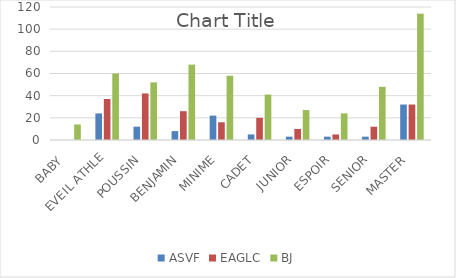
| Category | ASVF | EAGLC | BJ |
|---|---|---|---|
| BABY  | 0 | 0 | 14 |
| EVEIL ATHLE | 24 | 37 | 60 |
| POUSSIN  | 12 | 42 | 52 |
| BENJAMIN  | 8 | 26 | 68 |
| MINIME  | 22 | 16 | 58 |
| CADET  | 5 | 20 | 41 |
| JUNIOR  | 3 | 10 | 27 |
| ESPOIR  | 3 | 5 | 24 |
| SENIOR  | 3 | 12 | 48 |
| MASTER  | 32 | 32 | 114 |